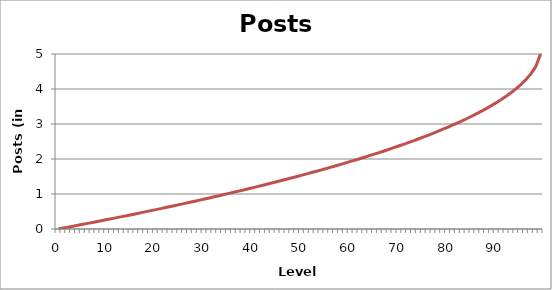
| Category | Posts Required |
|---|---|
| 0.0 | 0 |
| 1.0 | 27 |
| 2.0 | 53 |
| 3.0 | 80 |
| 4.0 | 106 |
| 5.0 | 133 |
| 6.0 | 160 |
| 7.0 | 187 |
| 8.0 | 214 |
| 9.0 | 242 |
| 10.0 | 269 |
| 11.0 | 297 |
| 12.0 | 325 |
| 13.0 | 353 |
| 14.0 | 381 |
| 15.0 | 409 |
| 16.0 | 438 |
| 17.0 | 467 |
| 18.0 | 496 |
| 19.0 | 525 |
| 20.0 | 554 |
| 21.0 | 583 |
| 22.0 | 613 |
| 23.0 | 643 |
| 24.0 | 673 |
| 25.0 | 703 |
| 26.0 | 733 |
| 27.0 | 764 |
| 28.0 | 795 |
| 29.0 | 826 |
| 30.0 | 857 |
| 31.0 | 888 |
| 32.0 | 920 |
| 33.0 | 952 |
| 34.0 | 984 |
| 35.0 | 1017 |
| 36.0 | 1049 |
| 37.0 | 1082 |
| 38.0 | 1115 |
| 39.0 | 1149 |
| 40.0 | 1183 |
| 41.0 | 1217 |
| 42.0 | 1251 |
| 43.0 | 1286 |
| 44.0 | 1321 |
| 45.0 | 1356 |
| 46.0 | 1392 |
| 47.0 | 1428 |
| 48.0 | 1464 |
| 49.0 | 1500 |
| 50.0 | 1538 |
| 51.0 | 1575 |
| 52.0 | 1613 |
| 53.0 | 1651 |
| 54.0 | 1689 |
| 55.0 | 1729 |
| 56.0 | 1768 |
| 57.0 | 1808 |
| 58.0 | 1848 |
| 59.0 | 1889 |
| 60.0 | 1931 |
| 61.0 | 1973 |
| 62.0 | 2015 |
| 63.0 | 2058 |
| 64.0 | 2102 |
| 65.0 | 2146 |
| 66.0 | 2191 |
| 67.0 | 2237 |
| 68.0 | 2283 |
| 69.0 | 2330 |
| 70.0 | 2378 |
| 71.0 | 2427 |
| 72.0 | 2477 |
| 73.0 | 2527 |
| 74.0 | 2579 |
| 75.0 | 2631 |
| 76.0 | 2685 |
| 77.0 | 2740 |
| 78.0 | 2796 |
| 79.0 | 2853 |
| 80.0 | 2912 |
| 81.0 | 2972 |
| 82.0 | 3034 |
| 83.0 | 3098 |
| 84.0 | 3164 |
| 85.0 | 3232 |
| 86.0 | 3303 |
| 87.0 | 3377 |
| 88.0 | 3453 |
| 89.0 | 3533 |
| 90.0 | 3617 |
| 91.0 | 3706 |
| 92.0 | 3800 |
| 93.0 | 3901 |
| 94.0 | 4011 |
| 95.0 | 4133 |
| 96.0 | 4270 |
| 97.0 | 4431 |
| 98.0 | 4637 |
| 99.0 | 5000 |